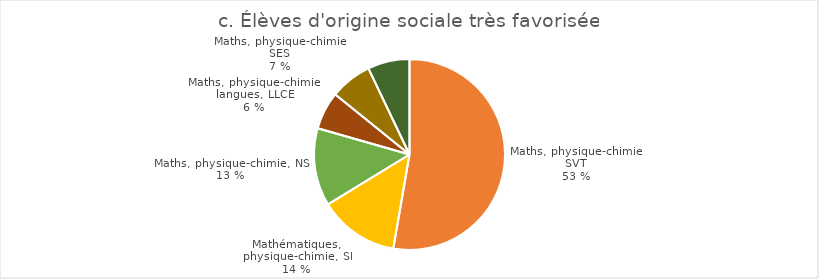
| Category | Élèves d'origine sociale très favorisée |
|---|---|
| Mathématiques, physique-chimie, SVT | 19785 |
| Mathématiques, physique-chimie, SI | 5081 |
| Mathématiques, physique-chimie, NSI | 4938 |
| Mathématiques, physique-chimie, LLCER | 2403 |
| Mathématiques, physique-chimie, SES | 2662 |
| Autres | 2659 |